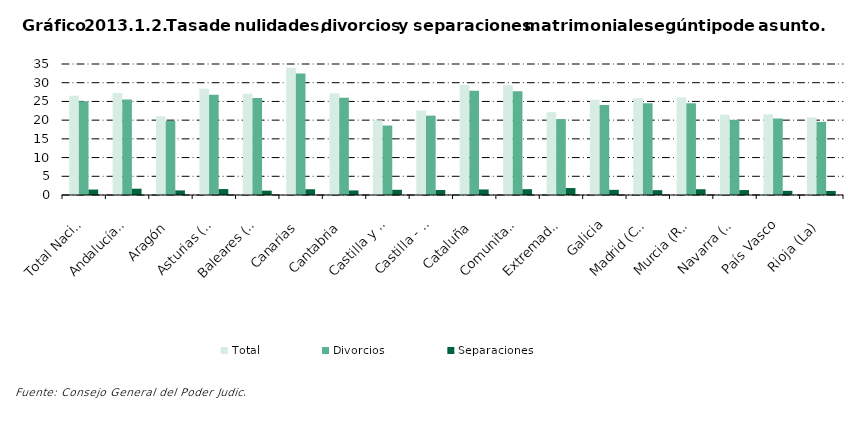
| Category | Total | Divorcios | Separaciones |
|---|---|---|---|
| Total Nacional | 26.517 | 25.023 | 1.456 |
| Andalucía(1) | 27.224 | 25.492 | 1.679 |
| Aragón | 21.03 | 19.79 | 1.225 |
| Asturias (Principado de) | 28.413 | 26.794 | 1.582 |
| Baleares (Illes) | 27.067 | 25.889 | 1.16 |
| Canarias | 34.016 | 32.459 | 1.539 |
| Cantabria | 27.184 | 25.951 | 1.216 |
| Castilla y León | 19.973 | 18.556 | 1.389 |
| Castilla - La Mancha | 22.58 | 21.209 | 1.328 |
| Cataluña | 29.39 | 27.861 | 1.48 |
| Comunitat Valenciana | 29.301 | 27.707 | 1.547 |
| Extremadura | 22.129 | 20.272 | 1.857 |
| Galicia | 25.438 | 24.024 | 1.377 |
| Madrid (Comunidad de) | 25.855 | 24.532 | 1.296 |
| Murcia (Región de) | 26.052 | 24.496 | 1.535 |
| Navarra (Comunidad Foral de) | 21.444 | 20.078 | 1.319 |
| País Vasco | 21.577 | 20.436 | 1.113 |
| Rioja (La) | 20.713 | 19.533 | 1.087 |